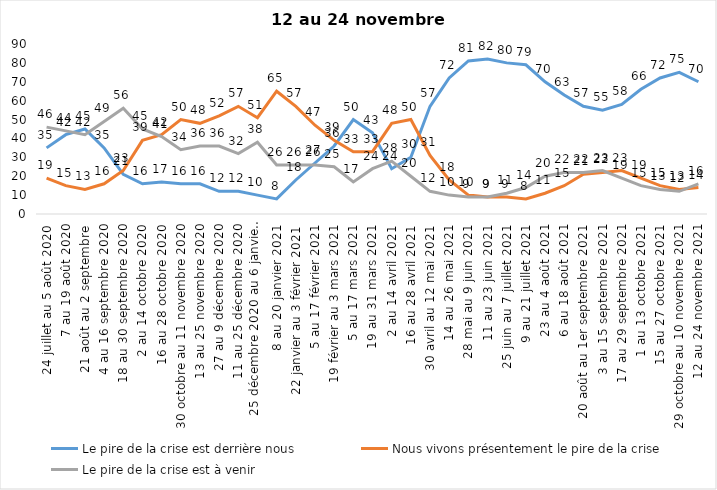
| Category | Le pire de la crise est derrière nous | Nous vivons présentement le pire de la crise | Le pire de la crise est à venir |
|---|---|---|---|
| 24 juillet au 5 août 2020 | 35 | 19 | 46 |
| 7 au 19 août 2020 | 42 | 15 | 44 |
| 21 août au 2 septembre | 45 | 13 | 42 |
| 4 au 16 septembre 2020 | 35 | 16 | 49 |
| 18 au 30 septembre 2020 | 21 | 23 | 56 |
| 2 au 14 octobre 2020 | 16 | 39 | 45 |
| 16 au 28 octobre 2020 | 17 | 42 | 41 |
| 30 octobre au 11 novembre 2020 | 16 | 50 | 34 |
| 13 au 25 novembre 2020 | 16 | 48 | 36 |
| 27 au 9 décembre 2020 | 12 | 52 | 36 |
| 11 au 25 décembre 2020 | 12 | 57 | 32 |
| 25 décembre 2020 au 6 janvier 2021 | 10 | 51 | 38 |
| 8 au 20 janvier 2021 | 8 | 65 | 26 |
| 22 janvier au 3 février 2021 | 18 | 57 | 26 |
| 5 au 17 février 2021 | 27 | 47 | 26 |
| 19 février au 3 mars 2021 | 36 | 39 | 25 |
| 5 au 17 mars 2021 | 50 | 33 | 17 |
| 19 au 31 mars 2021 | 43 | 33 | 24 |
| 2 au 14 avril 2021 | 24 | 48 | 28 |
| 16 au 28 avril 2021 | 30 | 50 | 20 |
| 30 avril au 12 mai 2021 | 57 | 31 | 12 |
| 14 au 26 mai 2021 | 72 | 18 | 10 |
| 28 mai au 9 juin 2021 | 81 | 10 | 9 |
| 11 au 23 juin 2021 | 82 | 9 | 9 |
| 25 juin au 7 juillet 2021 | 80 | 9 | 11 |
| 9 au 21 juillet 2021 | 79 | 8 | 14 |
| 23 au 4 août 2021 | 70 | 11 | 20 |
| 6 au 18 août 2021 | 63 | 15 | 22 |
| 20 août au 1er septembre 2021 | 57 | 21 | 22 |
| 3 au 15 septembre 2021 | 55 | 22 | 23 |
| 17 au 29 septembre 2021 | 58 | 23 | 19 |
| 1 au 13 octobre 2021 | 66 | 19 | 15 |
| 15 au 27 octobre 2021 | 72 | 15 | 13 |
| 29 octobre au 10 novembre 2021 | 75 | 13 | 12 |
| 12 au 24 novembre 2021 | 70 | 14 | 16 |